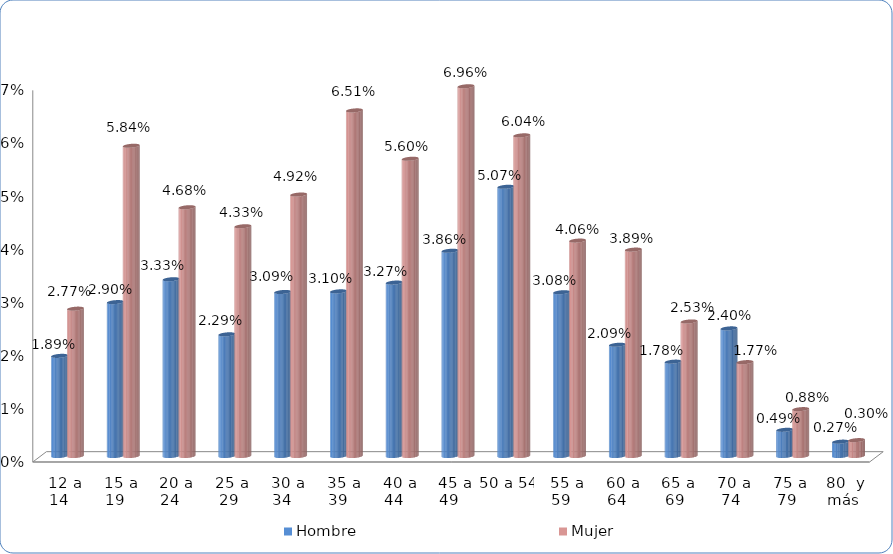
| Category | Hombre | Mujer |
|---|---|---|
|  12 a 14  | 0.019 | 0.028 |
|  15 a 19  | 0.029 | 0.058 |
|  20 a 24  | 0.033 | 0.047 |
|  25 a 29 | 0.023 | 0.043 |
|  30 a 34  | 0.031 | 0.049 |
|  35 a 39  | 0.031 | 0.065 |
|  40 a 44  | 0.033 | 0.056 |
|  45 a 49  | 0.039 | 0.07 |
| 50 a 54  | 0.051 | 0.06 |
|  55 a 59  | 0.031 | 0.041 |
|  60 a 64  | 0.021 | 0.039 |
|  65 a 69 | 0.018 | 0.025 |
|  70 a 74 | 0.024 | 0.018 |
|  75 a 79 | 0.005 | 0.009 |
|  80  y más | 0.003 | 0.003 |